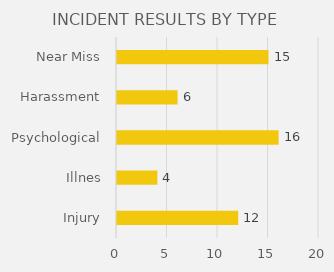
| Category | INCIDENT RESULTS BY TYPE |
|---|---|
| Injury | 12 |
| Illnes | 4 |
| Psychological | 16 |
| Harassment | 6 |
| Near Miss | 15 |